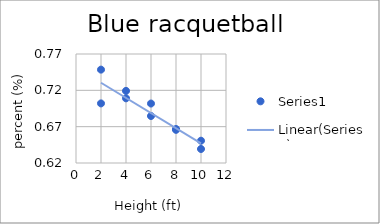
| Category | Series 0 |
|---|---|
| 10.0 | 0.651 |
| 10.0 | 0.639 |
| 8.0 | 0.666 |
| 8.0 | 0.667 |
| 6.0 | 0.685 |
| 6.0 | 0.702 |
| 4.0 | 0.709 |
| 4.0 | 0.719 |
| 2.0 | 0.748 |
| 2.0 | 0.702 |